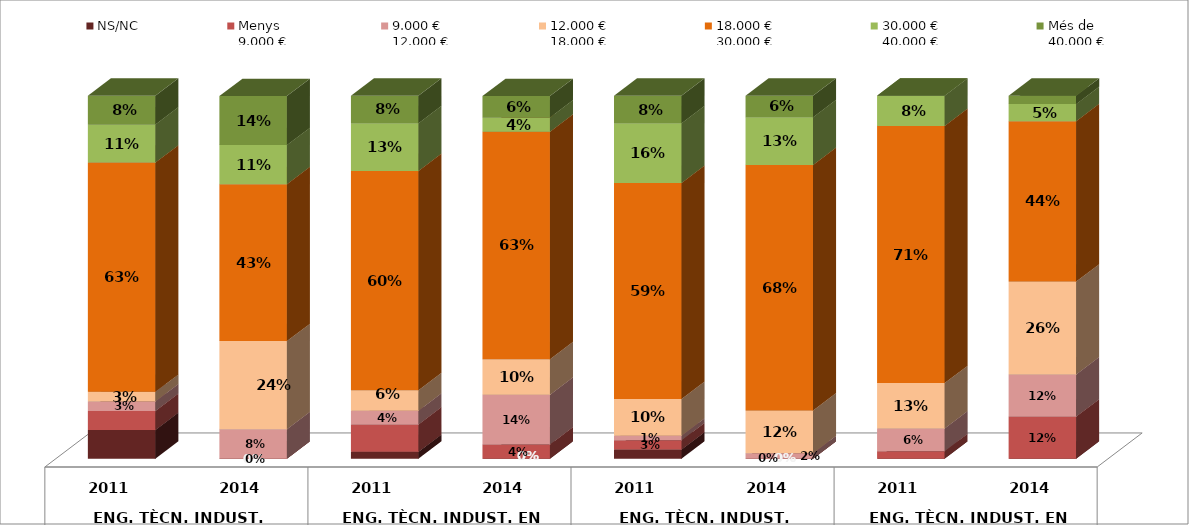
| Category | NS/NC | Menys 
9.000 € | 9.000 €
12.000 € | 12.000 €
18.000 € | Series 4 | 18.000 €
30.000 € | Series 6 | 30.000 €
40.000 € | Més de 
40.000 € |
|---|---|---|---|---|---|---|---|---|---|
| 0 | 0.079 | 0.053 | 0.026 | 0.026 |  | 0.632 |  | 0.105 | 0.079 |
| 1 | 0 | 0 | 0.081 | 0.243 |  | 0.432 |  | 0.108 | 0.135 |
| 2 | 0.019 | 0.075 | 0.038 | 0.057 |  | 0.604 |  | 0.132 | 0.075 |
| 3 | 0 | 0.039 | 0.137 | 0.098 |  | 0.627 |  | 0.039 | 0.059 |
| 4 | 0.025 | 0.025 | 0.013 | 0.101 |  | 0.595 |  | 0.165 | 0.076 |
| 5 | 0 | 0 | 0.015 | 0.118 |  | 0.676 |  | 0.132 | 0.059 |
| 6 | 0 | 0.021 | 0.062 | 0.125 |  | 0.708 |  | 0.083 | 0 |
| 7 | 0 | 0.116 | 0.116 | 0.256 |  | 0.442 |  | 0.047 | 0.023 |